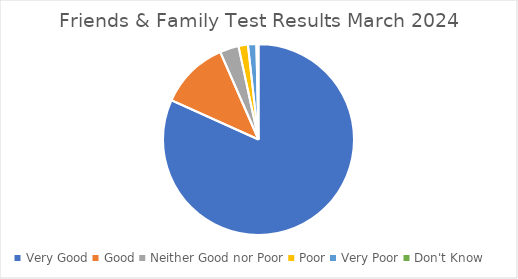
| Category | Series 0 |
|---|---|
| Very Good | 461 |
| Good | 66 |
| Neither Good nor Poor | 18 |
| Poor | 9 |
| Very Poor | 8 |
| Don't Know | 2 |